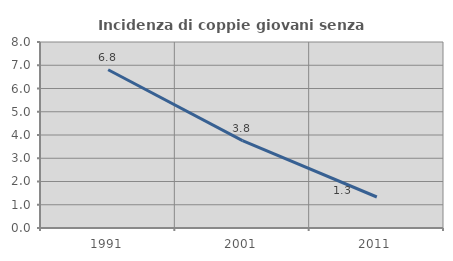
| Category | Incidenza di coppie giovani senza figli |
|---|---|
| 1991.0 | 6.806 |
| 2001.0 | 3.756 |
| 2011.0 | 1.333 |